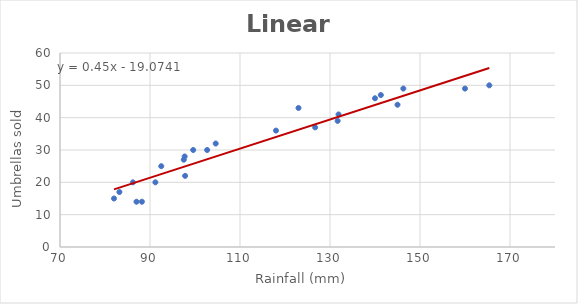
| Category | Umbrellas sold |
|---|---|
| 82.0 | 15 |
| 92.5 | 25 |
| 83.2 | 17 |
| 97.7 | 28 |
| 131.9 | 41 |
| 141.3 | 47 |
| 165.4 | 50 |
| 140.0 | 46 |
| 126.7 | 37 |
| 97.8 | 22 |
| 86.2 | 20 |
| 99.6 | 30 |
| 87.0 | 14 |
| 97.5 | 27 |
| 88.2 | 14 |
| 102.7 | 30 |
| 123.0 | 43 |
| 146.3 | 49 |
| 160.0 | 49 |
| 145.0 | 44 |
| 131.7 | 39 |
| 118.0 | 36 |
| 91.2 | 20 |
| 104.6 | 32 |